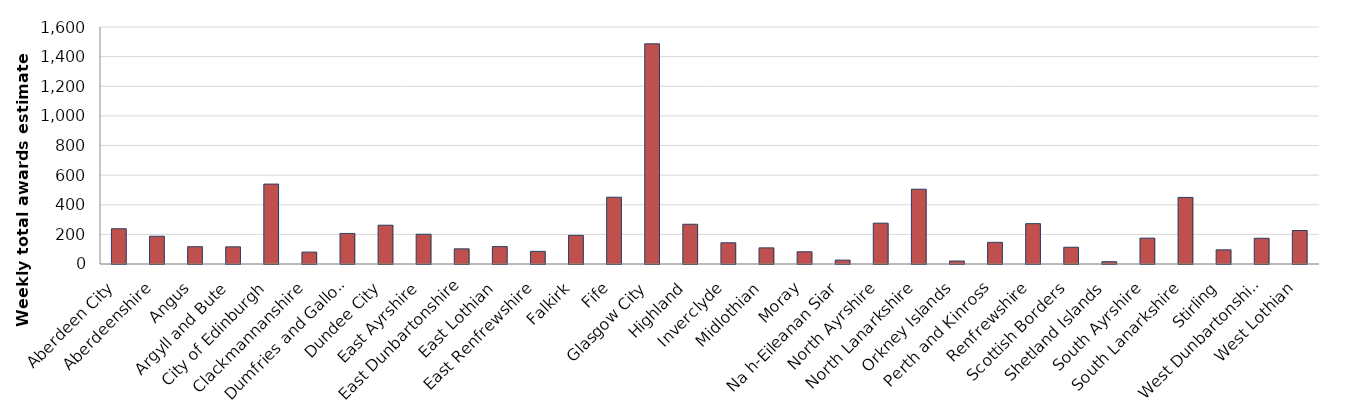
| Category | CTR Weekly 
income forgone 
est. (£'000s) |
|---|---|
| Aberdeen City | 238.184 |
| Aberdeenshire | 187.382 |
| Angus | 116.68 |
| Argyll and Bute | 115.848 |
| City of Edinburgh | 539.495 |
| Clackmannanshire | 80.275 |
| Dumfries and Galloway | 206.271 |
| Dundee City | 261.818 |
| East Ayrshire | 200.818 |
| East Dunbartonshire | 102.251 |
| East Lothian | 117.415 |
| East Renfrewshire | 85.194 |
| Falkirk | 193.45 |
| Fife | 450.908 |
| Glasgow City | 1486.544 |
| Highland | 268.251 |
| Inverclyde | 143.316 |
| Midlothian | 108.876 |
| Moray | 82.583 |
| Na h-Eileanan Siar | 26.231 |
| North Ayrshire | 275.677 |
| North Lanarkshire | 504.882 |
| Orkney Islands | 20.097 |
| Perth and Kinross | 146.16 |
| Renfrewshire | 272.276 |
| Scottish Borders | 113.163 |
| Shetland Islands | 15.359 |
| South Ayrshire | 174.637 |
| South Lanarkshire | 449.43 |
| Stirling | 95.619 |
| West Dunbartonshire | 173.719 |
| West Lothian | 226.113 |